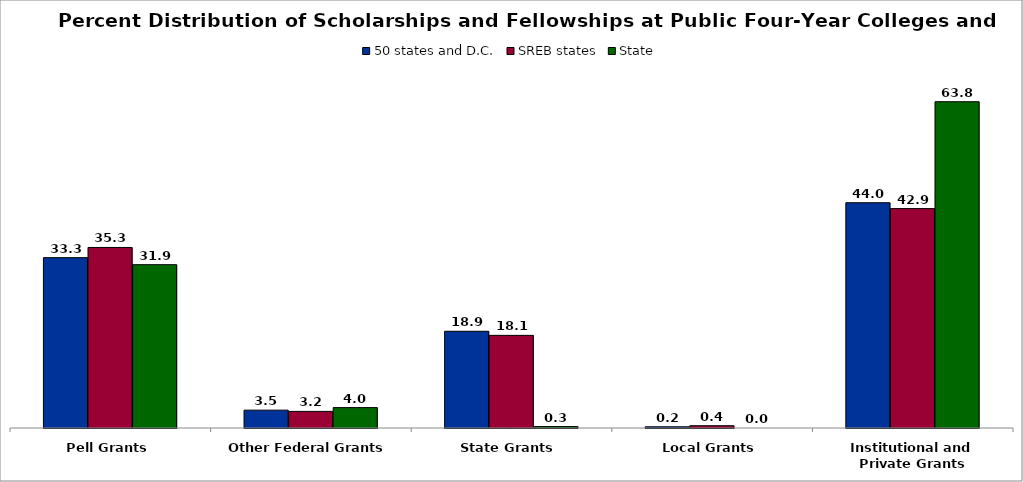
| Category | 50 states and D.C. | SREB states | State |
|---|---|---|---|
| Pell Grants | 33.31 | 35.3 | 31.933 |
| Other Federal Grants | 3.489 | 3.245 | 3.987 |
| State Grants | 18.918 | 18.111 | 0.281 |
| Local Grants | 0.236 | 0.444 | 0 |
| Institutional and Private Grants | 44.047 | 42.9 | 63.799 |